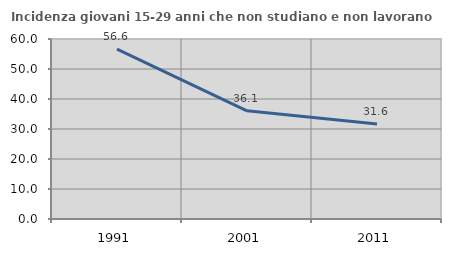
| Category | Incidenza giovani 15-29 anni che non studiano e non lavorano  |
|---|---|
| 1991.0 | 56.63 |
| 2001.0 | 36.068 |
| 2011.0 | 31.646 |